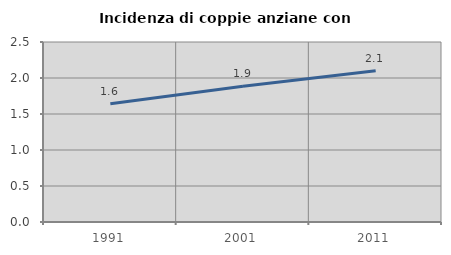
| Category | Incidenza di coppie anziane con figli |
|---|---|
| 1991.0 | 1.642 |
| 2001.0 | 1.887 |
| 2011.0 | 2.102 |